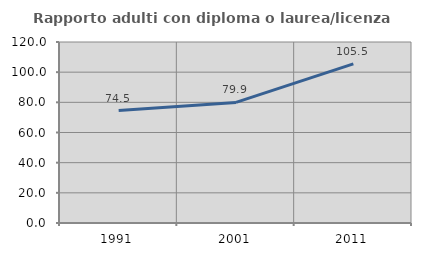
| Category | Rapporto adulti con diploma o laurea/licenza media  |
|---|---|
| 1991.0 | 74.528 |
| 2001.0 | 79.937 |
| 2011.0 | 105.484 |